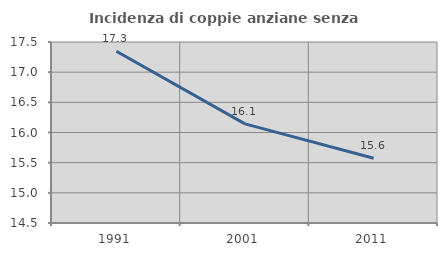
| Category | Incidenza di coppie anziane senza figli  |
|---|---|
| 1991.0 | 17.346 |
| 2001.0 | 16.142 |
| 2011.0 | 15.574 |